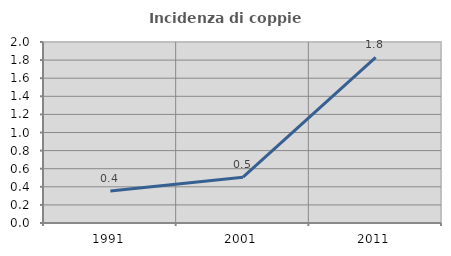
| Category | Incidenza di coppie miste |
|---|---|
| 1991.0 | 0.355 |
| 2001.0 | 0.506 |
| 2011.0 | 1.83 |